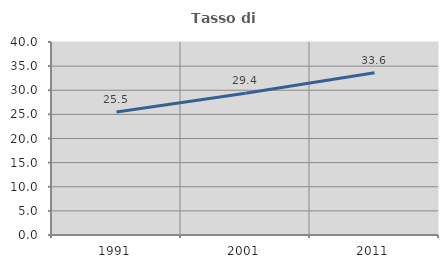
| Category | Tasso di occupazione   |
|---|---|
| 1991.0 | 25.502 |
| 2001.0 | 29.357 |
| 2011.0 | 33.613 |